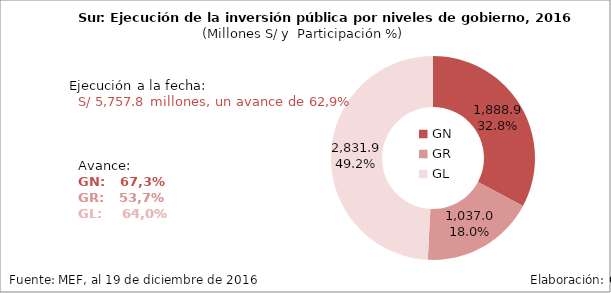
| Category | Ejecutado |
|---|---|
| GN | 1888.942 |
| GR | 1037.017 |
| GL | 2831.872 |